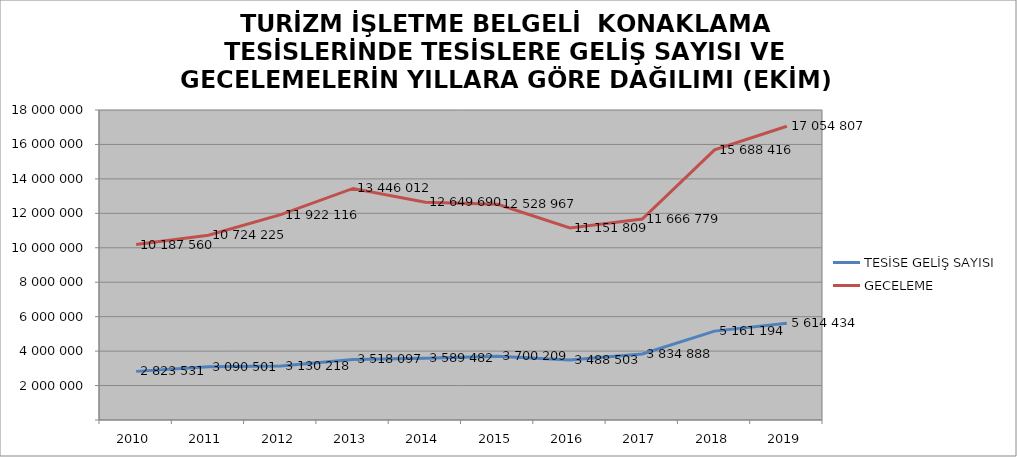
| Category | TESİSE GELİŞ SAYISI | GECELEME |
|---|---|---|
| 2010 | 2823531 | 10187560 |
| 2011 | 3090501 | 10724225 |
| 2012 | 3130218 | 11922116 |
| 2013 | 3518097 | 13446012 |
| 2014 | 3589482 | 12649690 |
| 2015 | 3700209 | 12528967 |
| 2016 | 3488503 | 11151809 |
| 2017 | 3834888 | 11666779 |
| 2018 | 5161194 | 15688416 |
| 2019 | 5614434 | 17054807 |